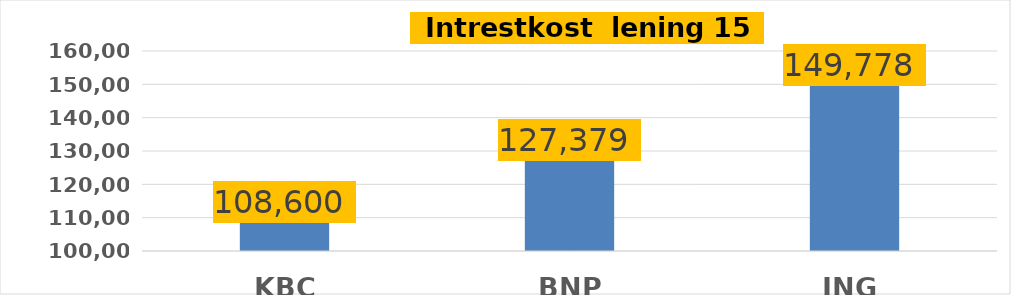
| Category | Intrestkost |
|---|---|
| KBC | 108600 |
| BNP | 127378.75 |
| ING | 149777.5 |